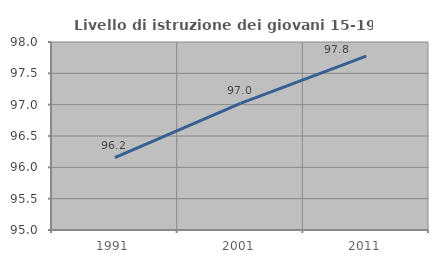
| Category | Livello di istruzione dei giovani 15-19 anni |
|---|---|
| 1991.0 | 96.154 |
| 2001.0 | 97.02 |
| 2011.0 | 97.773 |